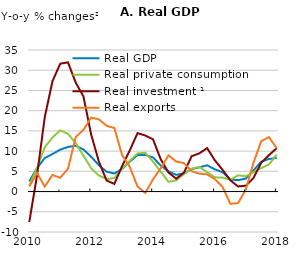
| Category | Real GDP | Real private consumption | Real investment ¹ | Real exports |
|---|---|---|---|---|
| 2010-03-01 | 2.515 | 1.478 | -7.534 | 1.23 |
| 2010-06-01 | 5.776 | 5.831 | 3.985 | 4.595 |
| 2010-09-01 | 8.289 | 10.966 | 18.4 | 1.24 |
| 2010-12-01 | 9.275 | 13.374 | 27.303 | 4.088 |
| 2011-03-01 | 10.358 | 15.131 | 31.608 | 3.422 |
| 2011-06-01 | 11.031 | 14.285 | 31.95 | 5.629 |
| 2011-09-01 | 11.323 | 11.977 | 26.957 | 13.454 |
| 2011-12-01 | 10.416 | 8.908 | 23.537 | 15.258 |
| 2012-03-01 | 8.606 | 5.742 | 14.121 | 18.272 |
| 2012-06-01 | 6.503 | 3.978 | 7.395 | 17.865 |
| 2012-09-01 | 4.918 | 3.092 | 2.735 | 16.258 |
| 2012-12-01 | 4.463 | 3.338 | 1.888 | 15.713 |
| 2013-03-01 | 5.58 | 5.629 | 6.292 | 9.003 |
| 2013-06-01 | 7.393 | 7.599 | 10.209 | 6.082 |
| 2013-09-01 | 9.04 | 9.433 | 14.447 | 1.239 |
| 2013-12-01 | 9.072 | 9.582 | 13.867 | -0.363 |
| 2014-03-01 | 8.437 | 7.419 | 12.918 | 3.02 |
| 2014-06-01 | 6.431 | 4.893 | 7.984 | 5.756 |
| 2014-09-01 | 4.984 | 2.406 | 4.714 | 8.953 |
| 2014-12-01 | 4.133 | 2.771 | 3.177 | 7.431 |
| 2015-03-01 | 4.488 | 4.326 | 4.671 | 7.029 |
| 2015-06-01 | 5.562 | 5.63 | 8.735 | 5.048 |
| 2015-09-01 | 5.996 | 6.12 | 9.453 | 4.422 |
| 2015-12-01 | 6.488 | 4.784 | 10.741 | 4.242 |
| 2016-03-01 | 5.49 | 3.52 | 7.712 | 3.07 |
| 2016-06-01 | 4.786 | 3.454 | 5.375 | 1.122 |
| 2016-09-01 | 2.976 | 2.929 | 2.79 | -3.012 |
| 2016-12-01 | 2.823 | 4.009 | 1.258 | -2.859 |
| 2017-03-01 | 3.21 | 3.785 | 1.452 | 0.48 |
| 2017-06-01 | 5.236 | 4.776 | 3.376 | 7.162 |
| 2017-09-01 | 7.388 | 5.811 | 7.117 | 12.478 |
| 2017-12-01 | 8.046 | 6.698 | 9.001 | 13.444 |
| 2018-03-01 | 8.342 | 9.155 | 10.738 | 10.707 |